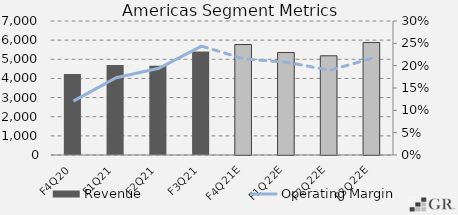
| Category | Revenue |
|---|---|
|  F4Q20  | 4232.9 |
|  F1Q21  | 4703.2 |
|  F2Q21  | 4664.6 |
|  F3Q21  | 5400.3 |
|  F4Q21E  | 5770.442 |
|  F1Q22E  | 5352.788 |
|  F2Q22E  | 5182.884 |
|  F3Q22E  | 5878.367 |